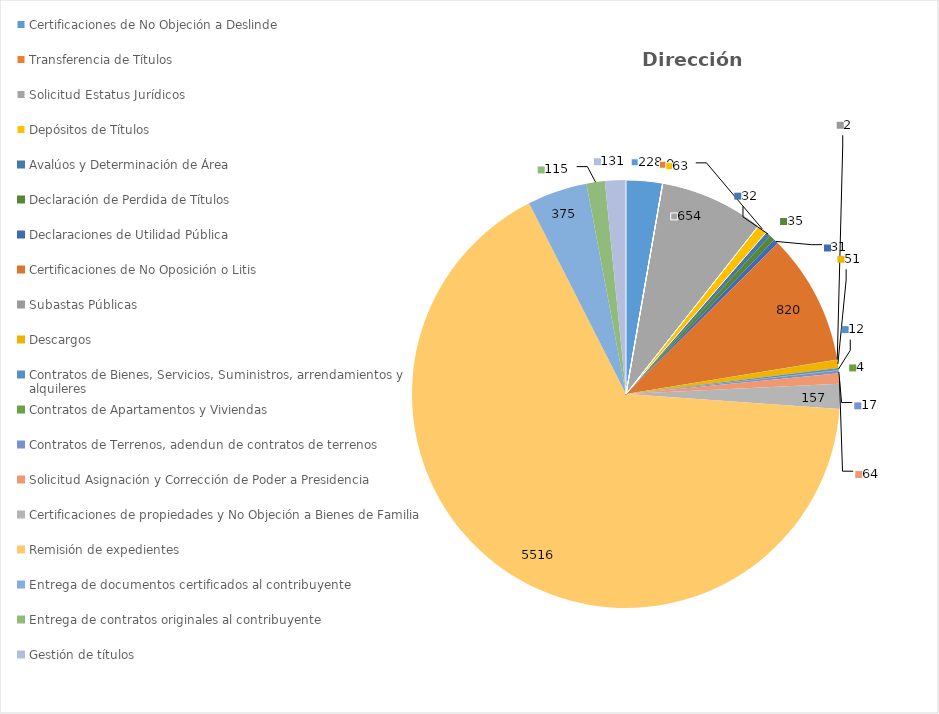
| Category | Series 0 |
|---|---|
| Certificaciones de No Objeción a Deslinde | 228 |
| Transferencia de Títulos  | 0 |
| Solicitud Estatus Jurídicos  | 654 |
| Depósitos de Títulos  | 63 |
| Avalúos y Determinación de Área | 32 |
| Declaración de Perdida de Títulos  | 35 |
| Declaraciones de Utilidad Pública | 31 |
| Certificaciones de No Oposición o Litis | 820 |
| Subastas Públicas | 2 |
| Descargos  | 51 |
| Contratos de Bienes, Servicios, Suministros, arrendamientos y alquileres | 12 |
| Contratos de Apartamentos y Viviendas  | 4 |
| Contratos de Terrenos, adendun de contratos de terrenos | 17 |
| Solicitud Asignación y Corrección de Poder a Presidencia | 64 |
| Certificaciones de propiedades y No Objeción a Bienes de Familia | 157 |
| Remisión de expedientes | 5516 |
| Entrega de documentos certificados al contribuyente | 375 |
| Entrega de contratos originales al contribuyente | 115 |
| Gestión de títulos | 131 |